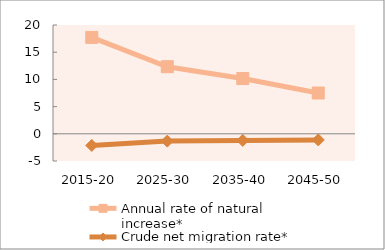
| Category | Annual rate of natural increase* | Crude net migration rate* |
|---|---|---|
| 2015-20 | 17.715 | -2.146 |
| 2025-30 | 12.333 | -1.342 |
| 2035-40 | 10.154 | -1.216 |
| 2045-50 | 7.499 | -1.125 |